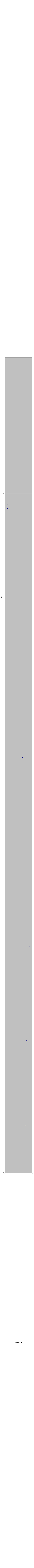
| Category | Series 0 |
|---|---|
| -1.3 | 0.203 |
| -6.25 | 0.244 |
| -6.25 | 0.246 |
| 7.6 | 0.131 |
| 8.6 | 0.029 |
| 8.5 | 0.042 |
| 1.05 | 0.126 |
| 5.45 | 0.017 |
| 8.2 | 0.062 |
| 8.2 | 0.083 |
| 5.25 | 0.122 |
| 4.6 | 0.042 |
| 6.25 | 0.049 |
| 3.7 | 0.149 |
| 3.65 | 0.153 |
| 3.65 | 0.153 |
| -2.55 | 0.222 |
| -2.9 | 0.222 |